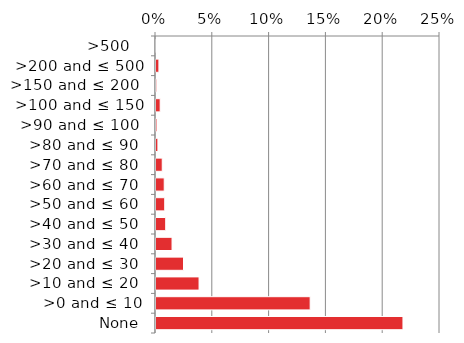
| Category | Native |
|---|---|
|  None | 0.218 |
| >0 and ≤ 10 | 0.137 |
| >10 and ≤ 20  | 0.039 |
| >20 and ≤ 30  | 0.025 |
| >30 and ≤ 40  | 0.015 |
| >40 and ≤ 50  | 0.009 |
| >50 and ≤ 60  | 0.009 |
| >60 and ≤ 70  | 0.008 |
| >70 and ≤ 80  | 0.006 |
| >80 and ≤ 90  | 0.003 |
| >90 and ≤ 100  | 0.002 |
| >100 and ≤ 150 | 0.005 |
| >150 and ≤ 200  | 0.002 |
| >200 and ≤ 500 | 0.003 |
| >500   | 0.001 |